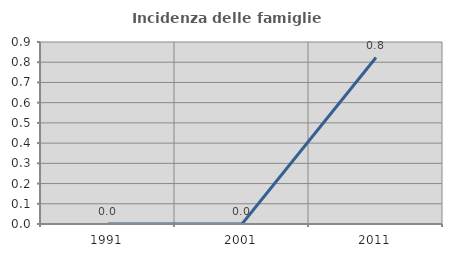
| Category | Incidenza delle famiglie numerose |
|---|---|
| 1991.0 | 0 |
| 2001.0 | 0 |
| 2011.0 | 0.823 |